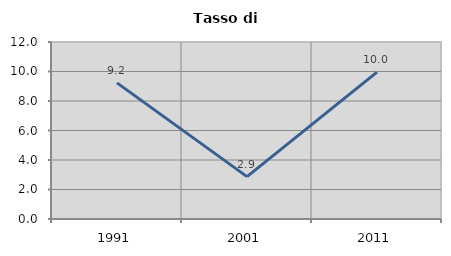
| Category | Tasso di disoccupazione   |
|---|---|
| 1991.0 | 9.231 |
| 2001.0 | 2.871 |
| 2011.0 | 9.959 |